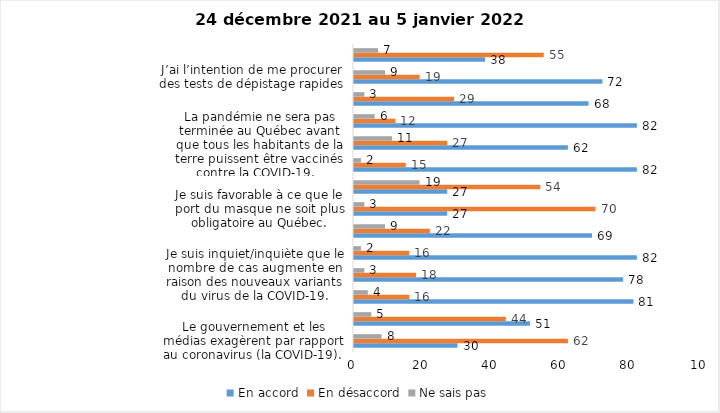
| Category | En accord | En désaccord | Ne sais pas |
|---|---|---|---|
| Le gouvernement et les médias exagèrent par rapport au coronavirus (la COVID-19). | 30 | 62 | 8 |
| Je suis favorable à la mise en place d’un couvre-feu. | 51 | 44 | 5 |
| J’ai peur que le système de santé soit débordé par les cas de COVID-19. | 81 | 16 | 4 |
| Je suis inquiet/inquiète que le nombre de cas augmente en raison des nouveaux variants du virus de la COVID-19. | 78 | 18 | 3 |
| Je suis favorable au passeport vaccinal qui permettrait l'accès à certains lieux ou activités aux personnes vaccinées. | 82 | 16 | 2 |
| Je suis confiant que la vaccination protège efficacement contre les variants de la COVID-19 | 69 | 22 | 9 |
| Je suis favorable à ce que le port du masque ne soit plus obligatoire au Québec. | 27 | 70 | 3 |
| La vaccination des enfants entre 5 et 11 ans mettra fin à la pandémie. | 27 | 54 | 19 |
| Il est important d'avoir des mesures de prévention pour la période des fêtes afin de limiter la propagation de la COVID-19. | 82 | 15 | 2 |
| La pandémie ne sera pas terminée au Québec avant que tous les habitants de la terre puissent être vaccinés contre la COVID-19.   | 62 | 27 | 11 |
| La dose de rappel (3e dose) de vaccin contre la COVID-19 devrait être offerte à toutes les personnes de 18 ans et plus.  | 82 | 12 | 6 |
| Je suis inconfortable d’être en contact avec une personne non vaccinée contre la COVID-19 | 68 | 29 | 3 |
| J’ai l’intention de me procurer des tests de dépistage rapides | 72 | 19 | 9 |
| Je n'ai pas peur du variant Omicron, car il semble moins dangereux pour la santé. | 38 | 55 | 7 |